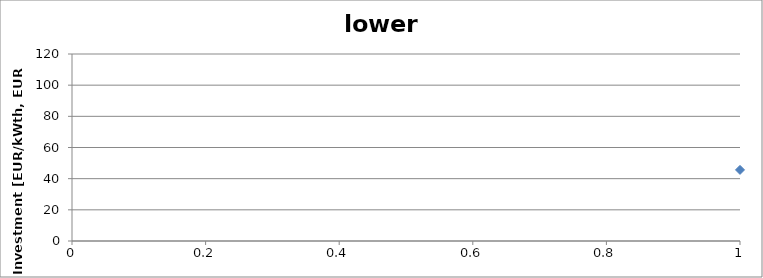
| Category | low ends |
|---|---|
| 0 | 45.624 |
| 1 | 114.06 |
| 2 | 34.218 |
| 3 | 58.821 |
| 4 | 20.212 |
| 5 | 16.537 |
| 6 | 31.994 |
| 7 | 23.282 |
| 8 | 33.066 |